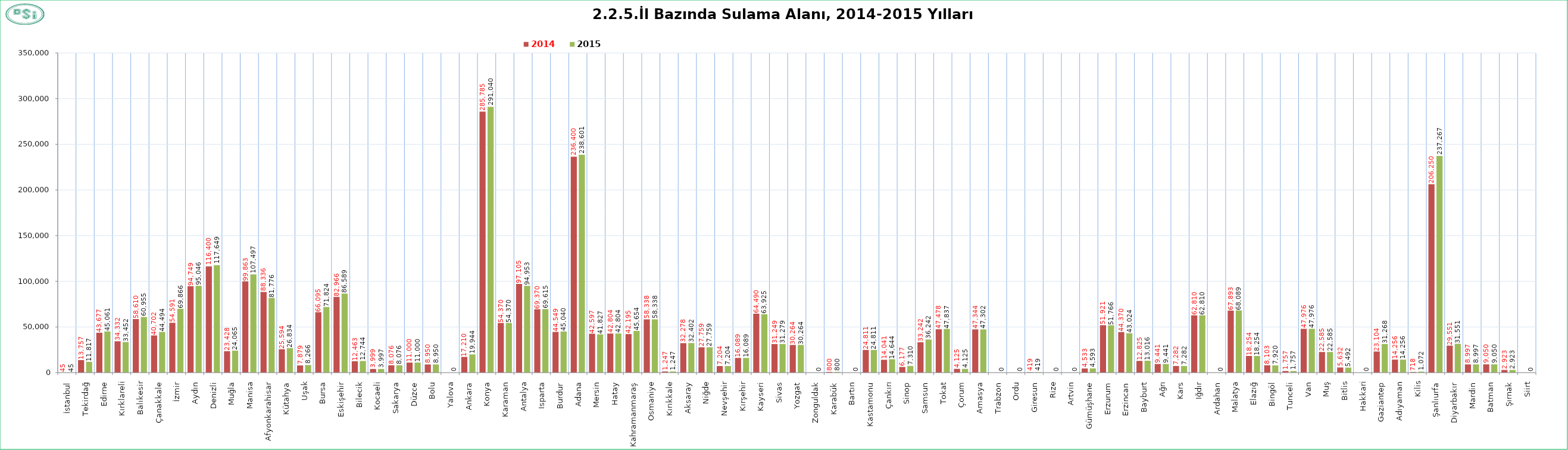
| Category | 2014 | 2015 |
|---|---|---|
| İstanbul | 45 | 45 |
| Tekirdağ | 13757 | 11817 |
| Edirne | 43677 | 45061 |
| Kırklareli | 34332 | 33452 |
| Balıkesir | 58610 | 60955 |
| Çanakkale | 40702 | 44494 |
| İzmir | 54591 | 69866 |
| Aydın | 94749 | 95046 |
| Denizli | 116400 | 117649 |
| Muğla | 23428 | 24065 |
| Manisa | 99863 | 107497 |
| Afyonkarahisar | 88336 | 81776 |
| Kütahya | 25594 | 26834 |
| Uşak | 7879 | 8266 |
| Bursa | 66095 | 71824 |
| Eskişehir | 82966 | 86589 |
| Bilecik | 12463 | 12744 |
| Kocaeli | 3999 | 3997 |
| Sakarya | 8076 | 8076 |
| Düzce | 11000 | 11000 |
| Bolu | 8950 | 8950 |
| Yalova | 0 | 0 |
| Ankara | 17210 | 19944 |
| Konya | 285785 | 291040 |
| Karaman | 54370 | 54370 |
| Antalya | 97105 | 94953 |
| Isparta | 69370 | 69615 |
| Burdur | 44549 | 45040 |
| Adana | 236400 | 238601 |
| Mersin | 42597 | 41827 |
| Hatay | 42804 | 42804 |
| Kahramanmaraş | 42195 | 45654 |
| Osmaniye | 58338 | 58338 |
| Kırıkkale | 1247 | 1247 |
| Aksaray | 32278 | 32402 |
| Niğde | 27759 | 27759 |
| Nevşehir | 7204 | 7204 |
| Kırşehir | 16089 | 16089 |
| Kayseri | 64490 | 63925 |
| Sivas | 31249 | 31279 |
| Yozgat | 30264 | 30264 |
| Zonguldak | 0 | 0 |
| Karabük | 800 | 800 |
| Bartın | 0 | 0 |
| Kastamonu | 24811 | 24811 |
| Çankırı | 14041 | 14644 |
| Sinop | 6177 | 7310 |
| Samsun | 33242 | 36242 |
| Tokat | 47478 | 47837 |
| Çorum | 4125 | 4125 |
| Amasya | 47344 | 47302 |
| Trabzon | 0 | 0 |
| Ordu | 0 | 0 |
| Giresun | 419 | 419 |
| Rize | 0 | 0 |
| Artvin | 0 | 0 |
| Gümüşhane | 4533 | 4593 |
| Erzurum | 51921 | 51766 |
| Erzincan | 44370 | 43024 |
| Bayburt | 12825 | 13016 |
| Ağrı | 9441 | 9441 |
| Kars | 7282 | 7282 |
| Iğdır | 62810 | 62810 |
| Ardahan | 0 | 0 |
| Malatya | 67893 | 68089 |
| Elazığ | 18254 | 18254 |
| Bingöl | 8103 | 7920 |
| Tunceli | 1757 | 1757 |
| Van | 47976 | 47976 |
| Muş | 22585 | 22585 |
| Bitlis | 5632 | 5492 |
| Hakkari | 0 | 0 |
| Gaziantep | 23104 | 31268 |
| Adıyaman | 14256 | 14256 |
| Kilis | 718 | 1072 |
| Şanlıurfa | 206250 | 237267 |
| Diyarbakır | 29551 | 31551 |
| Mardin | 8997 | 8997 |
| Batman | 9050 | 9050 |
| Şırnak | 2923 | 2923 |
| Siirt | 0 | 0 |